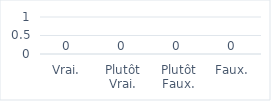
| Category | Series 0 |
|---|---|
| Vrai. | 0 |
| Plutôt Vrai. | 0 |
| Plutôt Faux. | 0 |
| Faux. | 0 |